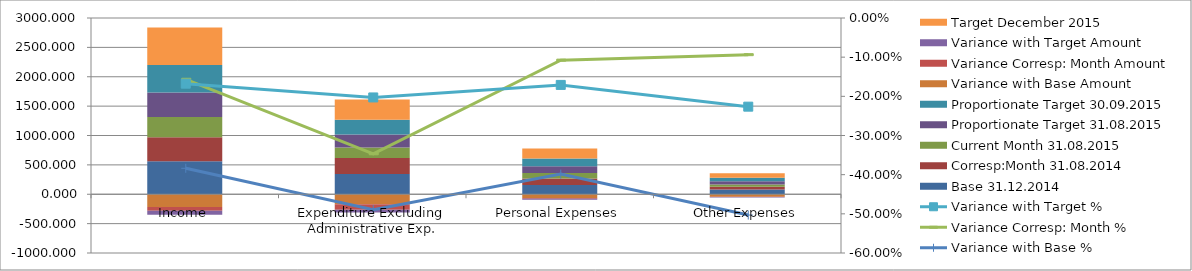
| Category | Base 31.12.2014 | Corresp:Month 31.08.2014 | Current Month 31.08.2015 | Proportionate Target 31.08.2015 | Proportionate Target 30.09.2015 | Variance with Base Amount  | Variance Corresp: Month Amount | Variance with Target Amount | Target December 2015 |
|---|---|---|---|---|---|---|---|---|---|
| Income | 560.924 | 409.789 | 345.675 | 415.293 | 469.806 | -215.249 | -64.114 | -69.618 | 636.325 |
| Expenditure Excluding Administrative Exp. | 346.73 | 271.056 | 177.085 | 222.144 | 252.16 | -169.645 | -93.971 | -45.059 | 345.207 |
| Personal Expenses | 158.91 | 107.095 | 95.576 | 115.267 | 129.675 | -63.334 | -11.519 | -19.691 | 172.9 |
| Other Expenses | 81.796 | 44.84 | 40.643 | 52.535 | 59.101 | -41.153 | -4.197 | -11.892 | 78.802 |